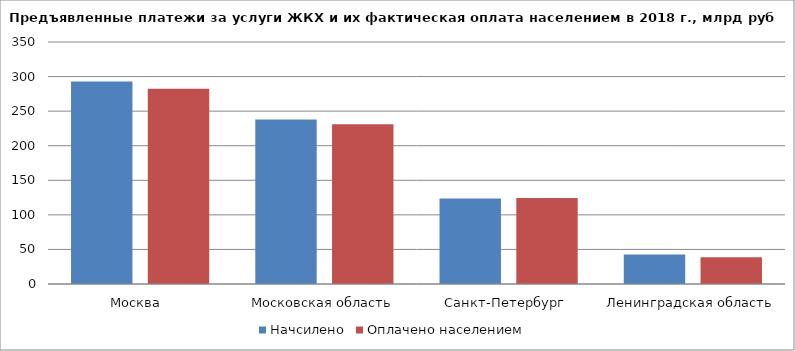
| Category | Начсилено | Оплачено населением  |
|---|---|---|
| Москва  | 292.8 | 282.5 |
| Московская область | 237.8 | 231 |
| Санкт-Петербург  | 123.8 | 124.4 |
| Ленинградская область | 42.8 | 38.8 |